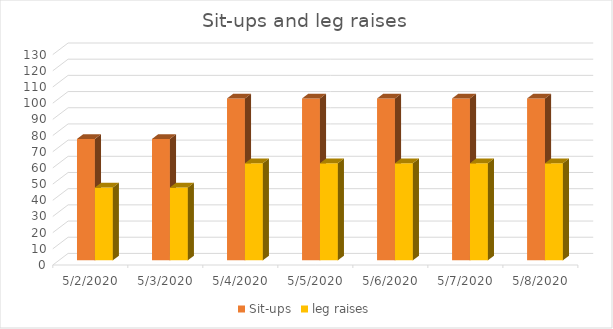
| Category | Sit-ups | leg raises |
|---|---|---|
| 5/2/20 | 75 | 45 |
| 5/3/20 | 75 | 45 |
| 5/4/20 | 100 | 60 |
| 5/5/20 | 100 | 60 |
| 5/6/20 | 100 | 60 |
| 5/7/20 | 100 | 60 |
| 5/8/20 | 100 | 60 |